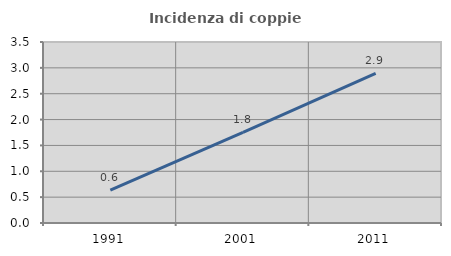
| Category | Incidenza di coppie miste |
|---|---|
| 1991.0 | 0.635 |
| 2001.0 | 1.755 |
| 2011.0 | 2.894 |